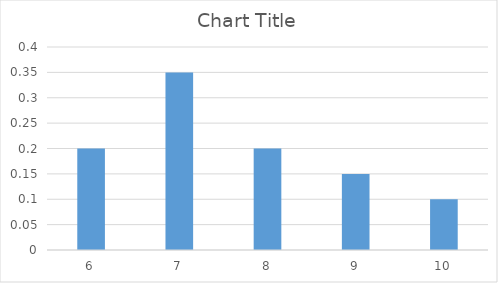
| Category | Series 0 |
|---|---|
| 6.0 | 0.2 |
| 7.0 | 0.35 |
| 8.0 | 0.2 |
| 9.0 | 0.15 |
| 10.0 | 0.1 |